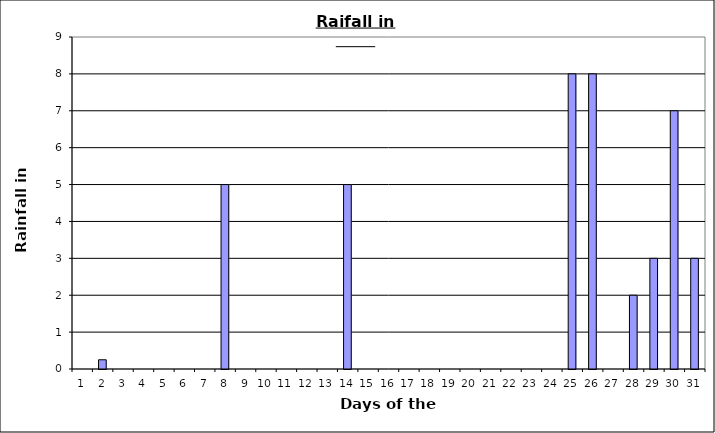
| Category | Rain |
|---|---|
| 0 | 0 |
| 1 | 0.25 |
| 2 | 0 |
| 3 | 0 |
| 4 | 0 |
| 5 | 0 |
| 6 | 0 |
| 7 | 5 |
| 8 | 0 |
| 9 | 0 |
| 10 | 0 |
| 11 | 0 |
| 12 | 0 |
| 13 | 5 |
| 14 | 0 |
| 15 | 0 |
| 16 | 0 |
| 17 | 0 |
| 18 | 0 |
| 19 | 0 |
| 20 | 0 |
| 21 | 0 |
| 22 | 0 |
| 23 | 0 |
| 24 | 8 |
| 25 | 8 |
| 26 | 0 |
| 27 | 2 |
| 28 | 3 |
| 29 | 7 |
| 30 | 3 |